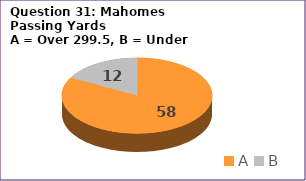
| Category | Series 0 |
|---|---|
| A | 58 |
| B | 12 |